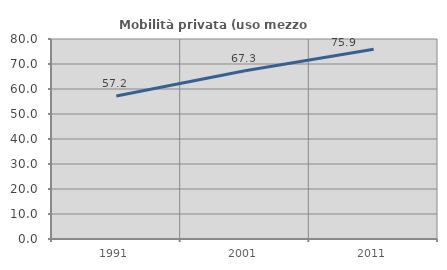
| Category | Mobilità privata (uso mezzo privato) |
|---|---|
| 1991.0 | 57.192 |
| 2001.0 | 67.274 |
| 2011.0 | 75.876 |